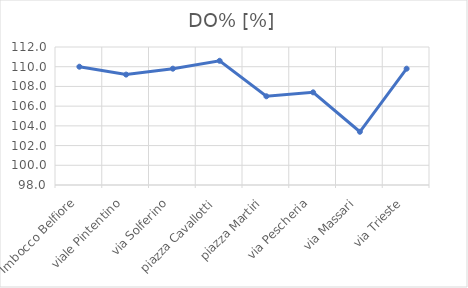
| Category | DO% [%] |
|---|---|
| Imbocco Belfiore | 110 |
| viale Pintentino | 109.2 |
| via Solferino | 109.8 |
| piazza Cavallotti | 110.6 |
| piazza Martiri | 107 |
| via Pescheria | 107.4 |
| via Massari | 103.4 |
| via Trieste | 109.8 |